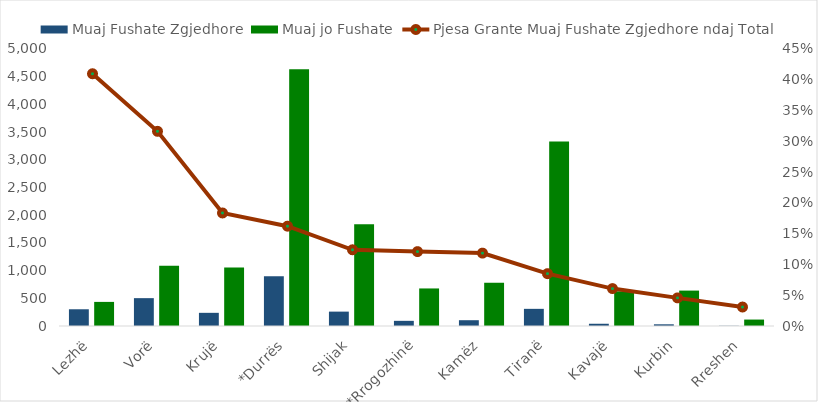
| Category | Muaj Fushate Zgjedhore | Muaj jo Fushate |
|---|---|---|
| Lezhë | 302.088 | 435.103 |
| Vorë | 502.766 | 1086.81 |
| Krujë | 237.763 | 1057.328 |
| *Durrës | 897.468 | 4636.664 |
| Shijak | 259.642 | 1837.519 |
| *Rrogozhinë | 93.198 | 677.9 |
| Kamëz | 104.558 | 778.486 |
| Tiranë | 309.685 | 3332.322 |
| Kavajë | 40.537 | 626.402 |
| Kurbin | 30.603 | 639.164 |
| Rreshen | 3.697 | 116.266 |